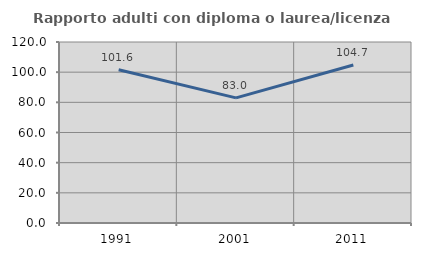
| Category | Rapporto adulti con diploma o laurea/licenza media  |
|---|---|
| 1991.0 | 101.639 |
| 2001.0 | 82.979 |
| 2011.0 | 104.706 |